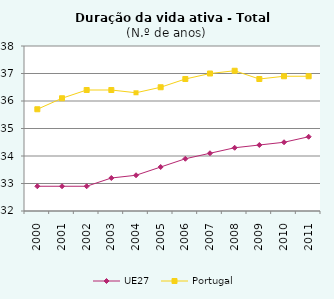
| Category | UE27 | Portugal |
|---|---|---|
| 2000.0 | 32.9 | 35.7 |
| 2001.0 | 32.9 | 36.1 |
| 2002.0 | 32.9 | 36.4 |
| 2003.0 | 33.2 | 36.4 |
| 2004.0 | 33.3 | 36.3 |
| 2005.0 | 33.6 | 36.5 |
| 2006.0 | 33.9 | 36.8 |
| 2007.0 | 34.1 | 37 |
| 2008.0 | 34.3 | 37.1 |
| 2009.0 | 34.4 | 36.8 |
| 2010.0 | 34.5 | 36.9 |
| 2011.0 | 34.7 | 36.9 |